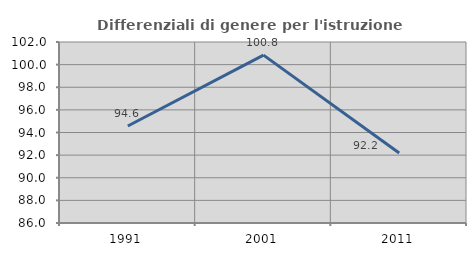
| Category | Differenziali di genere per l'istruzione superiore |
|---|---|
| 1991.0 | 94.575 |
| 2001.0 | 100.837 |
| 2011.0 | 92.19 |